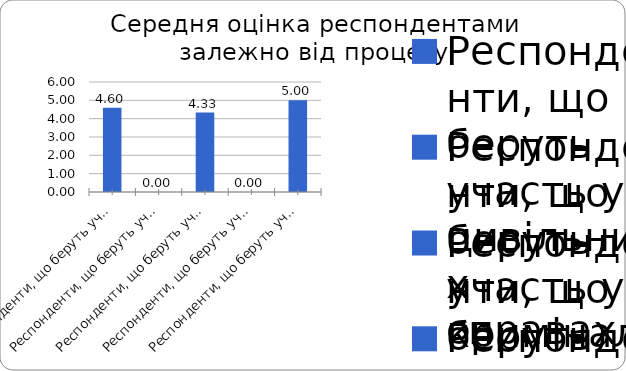
| Category | Series 0 |
|---|---|
| Респонденти, що беруть участь у цивільних справах | 4.6 |
| Респонденти, що беруть участь у кримінальних справах | 0 |
| Респонденти, що беруть участь у адміністративних справах | 4.333 |
| Респонденти, що беруть участь у господарських справах | 0 |
| Респонденти, що беруть участь у справах про адміністративні правопорушення | 5 |